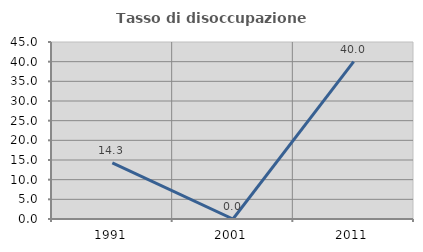
| Category | Tasso di disoccupazione giovanile  |
|---|---|
| 1991.0 | 14.286 |
| 2001.0 | 0 |
| 2011.0 | 40 |